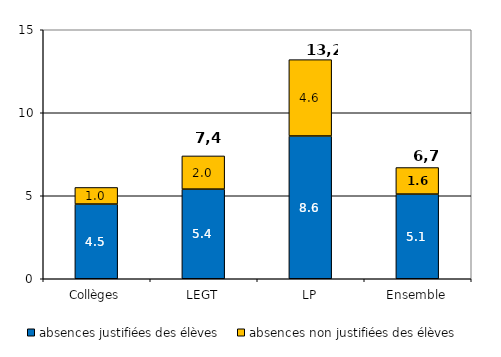
| Category | absences justifiées des élèves | absences non justifiées des élèves |
|---|---|---|
| Collèges | 4.5 | 1 |
| LEGT | 5.4 | 2 |
| LP | 8.6 | 4.6 |
| Ensemble | 5.1 | 1.6 |